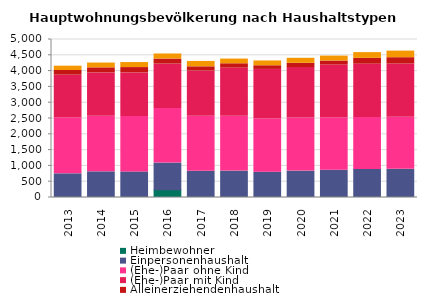
| Category | Heimbewohner | Einpersonenhaushalt | (Ehe-)Paar ohne Kind | (Ehe-)Paar mit Kind | Alleinerziehendenhaushalt | sonstiger Mehrpersonenhaushalt |
|---|---|---|---|---|---|---|
| 2013.0 | 0 | 749 | 1778 | 1343 | 149 | 137 |
| 2014.0 | 0 | 812 | 1757 | 1373 | 161 | 152 |
| 2015.0 | 0 | 809 | 1751 | 1382 | 170 | 158 |
| 2016.0 | 245 | 845 | 1727 | 1403 | 161 | 161 |
| 2017.0 | 0 | 830 | 1739 | 1430 | 137 | 170 |
| 2018.0 | 0 | 836 | 1736 | 1523 | 137 | 149 |
| 2019.0 | 0 | 803 | 1688 | 1562 | 116 | 152 |
| 2020.0 | 0 | 836 | 1676 | 1598 | 137 | 158 |
| 2021.0 | 0 | 863 | 1661 | 1667 | 128 | 155 |
| 2022.0 | 0 | 890 | 1640 | 1691 | 182 | 182 |
| 2023.0 | 0 | 893 | 1646 | 1685 | 200 | 209 |